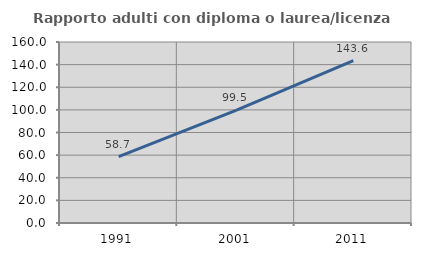
| Category | Rapporto adulti con diploma o laurea/licenza media  |
|---|---|
| 1991.0 | 58.704 |
| 2001.0 | 99.519 |
| 2011.0 | 143.592 |